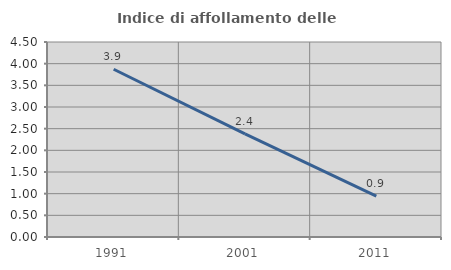
| Category | Indice di affollamento delle abitazioni  |
|---|---|
| 1991.0 | 3.871 |
| 2001.0 | 2.379 |
| 2011.0 | 0.942 |